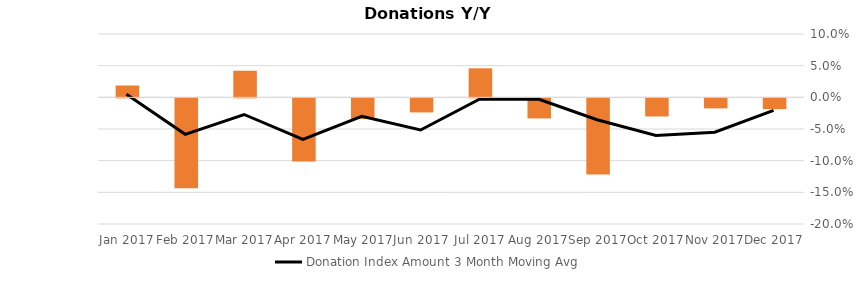
| Category | Donation Index Amount Y/Y Growth |
|---|---|
| Dec 2017 | -0.017 |
| Nov 2017 | -0.016 |
| Oct 2017 | -0.029 |
| Sep 2017 | -0.12 |
| Aug 2017 | -0.032 |
| Jul 2017 | 0.046 |
| Jun 2017 | -0.022 |
| May 2017 | -0.033 |
| Apr 2017 | -0.1 |
| Mar 2017 | 0.042 |
| Feb 2017 | -0.142 |
| Jan 2017 | 0.019 |